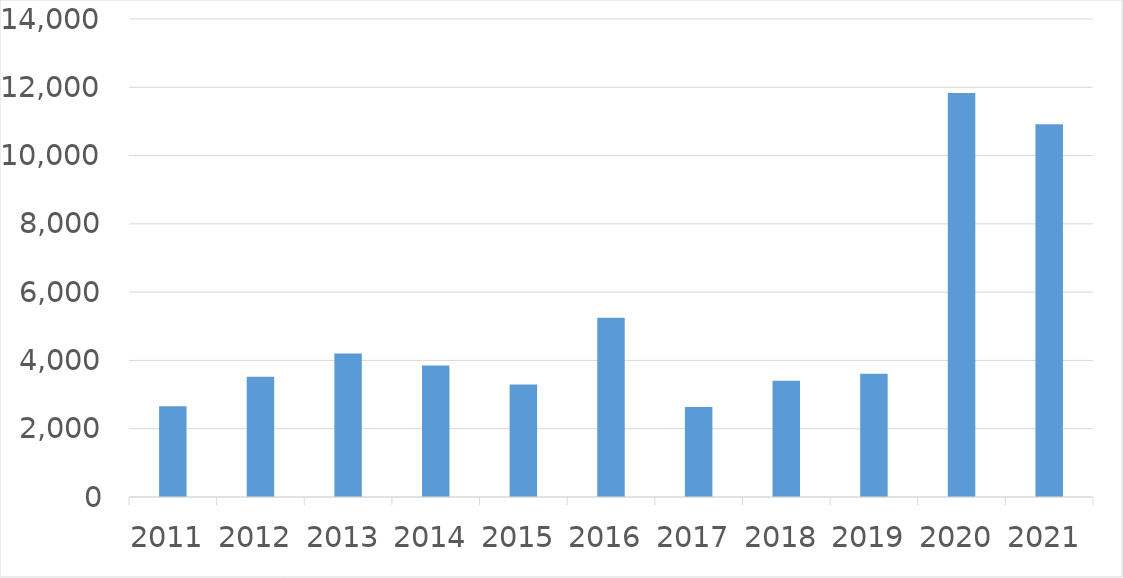
| Category | Series 0 |
|---|---|
| 2011 | 2656 |
| 2012 | 3524 |
| 2013 | 4200 |
| 2014 | 3849 |
| 2015 | 3294 |
| 2016 | 5249 |
| 2017 | 2636 |
| 2018 | 3406 |
| 2019 | 3611 |
| 2020 | 11835 |
| 2021 | 10919 |